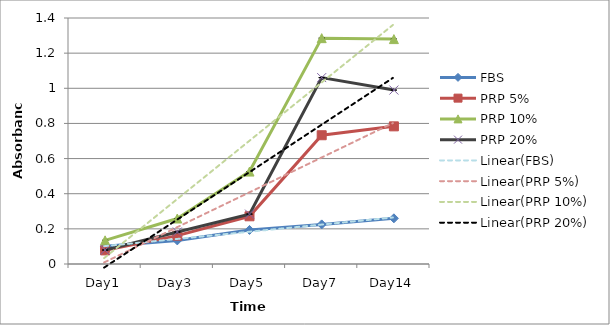
| Category | FBS | PRP 5% | PRP 10% | PRP 20% |
|---|---|---|---|---|
| Day1 | 0.101 | 0.077 | 0.135 | 0.08 |
| Day3 | 0.134 | 0.161 | 0.259 | 0.182 |
| Day5 | 0.194 | 0.272 | 0.526 | 0.284 |
| Day7 | 0.225 | 0.733 | 1.285 | 1.061 |
| Day14 | 0.26 | 0.783 | 1.28 | 0.99 |